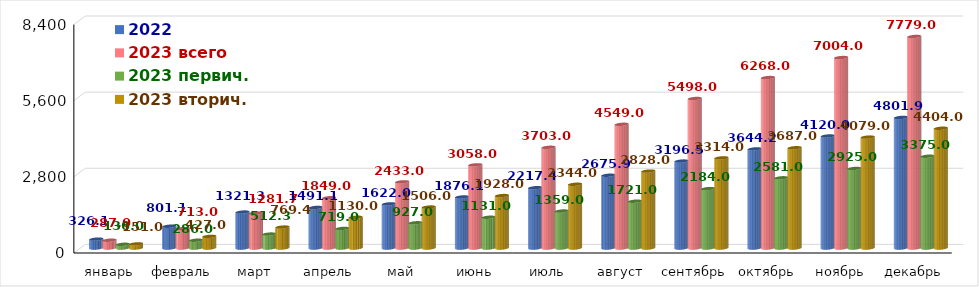
| Category | 2022 | 2023 всего | 2023 первич. | 2023 вторич. |
|---|---|---|---|---|
| январь | 326.136 | 287 | 136 | 151 |
| февраль | 801.124 | 713 | 286 | 427 |
| март | 1321.34 | 1281.7 | 512.3 | 769.4 |
| апрель | 1491.129 | 1849 | 719 | 1130 |
| май | 1622 | 2433 | 927 | 1506 |
| июнь | 1876.074 | 3058 | 1131 | 1928 |
| июль | 2217.365 | 3703 | 1359 | 2344 |
| август | 2675.882 | 4549 | 1721 | 2828 |
| сентябрь | 3196.512 | 5498 | 2184 | 3314 |
| октябрь | 3644.186 | 6268 | 2581 | 3687 |
| ноябрь | 4120 | 7004 | 2925 | 4079 |
| декабрь | 4801.852 | 7779 | 3375 | 4404 |